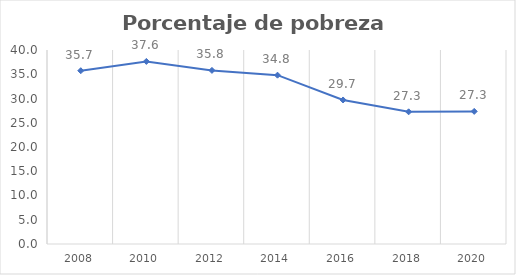
| Category | Series 0 |
|---|---|
| 2008.0 | 35.73 |
| 2010.0 | 37.646 |
| 2012.0 | 35.794 |
| 2014.0 | 34.81 |
| 2016.0 | 29.697 |
| 2018.0 | 27.255 |
| 2020.0 | 27.343 |